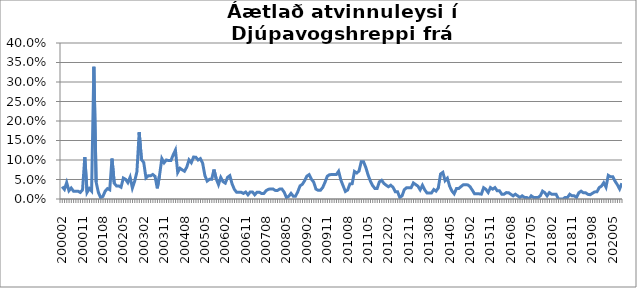
| Category | Series 0 |
|---|---|
| 200002 | 0.032 |
| 200003 | 0.025 |
| 200004 | 0.042 |
| 200005 | 0.021 |
| 200006 | 0.028 |
| 200007 | 0.02 |
| 200008 | 0.02 |
| 200009 | 0.02 |
| 200010 | 0.017 |
| 200011 | 0.023 |
| 200012 | 0.107 |
| 200101 | 0.017 |
| 200102 | 0.027 |
| 200103 | 0.02 |
| 200104 | 0.339 |
| 200105 | 0.044 |
| 200106 | 0.017 |
| 200107 | 0.003 |
| 200108 | 0.007 |
| 200109 | 0.02 |
| 200110 | 0.027 |
| 200111 | 0.023 |
| 200112 | 0.104 |
| 200201 | 0.04 |
| 200202 | 0.034 |
| 200203 | 0.034 |
| 200204 | 0.03 |
| 200205 | 0.054 |
| 200206 | 0.05 |
| 200207 | 0.042 |
| 200208 | 0.056 |
| 200209 | 0.028 |
| 200210 | 0.045 |
| 200211 | 0.07 |
| 200212 | 0.171 |
| 200301 | 0.101 |
| 200302 | 0.094 |
| 200303 | 0.054 |
| 200304 | 0.059 |
| 200305 | 0.059 |
| 200306 | 0.063 |
| 200307 | 0.058 |
| 200308 | 0.027 |
| 200309 | 0.061 |
| 200310 | 0.104 |
| 200311 | 0.093 |
| 200312 | 0.1 |
| 200401 | 0.099 |
| 200402 | 0.099 |
| 200403 | 0.113 |
| 200404 | 0.125 |
| 200405 | 0.068 |
| 200406 | 0.079 |
| 200407 | 0.075 |
| 200408 | 0.071 |
| 200409 | 0.082 |
| 200410 | 0.1 |
| 200411 | 0.093 |
| 200412 | 0.108 |
| 200501 | 0.107 |
| 200502 | 0.1 |
| 200503 | 0.104 |
| 200504 | 0.092 |
| 200505 | 0.06 |
| 200506 | 0.046 |
| 200507 | 0.05 |
| 200508 | 0.05 |
| 200509 | 0.076 |
| 200510 | 0.052 |
| 200511 | 0.037 |
| 200512 | 0.055 |
| 200601 | 0.044 |
| 200602 | 0.041 |
| 200603 | 0.056 |
| 200604 | 0.06 |
| 200605 | 0.039 |
| 200606 | 0.025 |
| 200607 | 0.017 |
| 200608 | 0.017 |
| 200609 | 0.017 |
| 200610 | 0.014 |
| 200611 | 0.018 |
| 200612 | 0.011 |
| 200701 | 0.018 |
| 200702 | 0.018 |
| 200703 | 0.011 |
| 200704 | 0.018 |
| 200705 | 0.018 |
| 200706 | 0.014 |
| 200707 | 0.014 |
| 200708 | 0.021 |
| 200709 | 0.025 |
| 200710 | 0.026 |
| 200711 | 0.026 |
| 200712 | 0.022 |
| 200801 | 0.022 |
| 200802 | 0.025 |
| 200803 | 0.025 |
| 200804 | 0.017 |
| 200805 | 0.003 |
| 200806 | 0.007 |
| 200807 | 0.014 |
| 200808 | 0.007 |
| 200809 | 0.007 |
| 200810 | 0.019 |
| 200811 | 0.034 |
| 200812 | 0.038 |
| 200901 | 0.047 |
| 200902 | 0.059 |
| 200903 | 0.062 |
| 200904 | 0.051 |
| 200905 | 0.043 |
| 200906 | 0.025 |
| 200907 | 0.022 |
| 200908 | 0.022 |
| 200909 | 0.03 |
| 200910 | 0.043 |
| 200911 | 0.058 |
| 200912 | 0.062 |
| 201001 | 0.063 |
| 201002 | 0.063 |
| 201003 | 0.063 |
| 201004 | 0.071 |
| 201005 | 0.049 |
| 201006 | 0.034 |
| 201007 | 0.019 |
| 201008 | 0.023 |
| 201009 | 0.039 |
| 201010 | 0.039 |
| 201011 | 0.071 |
| 201012 | 0.067 |
| 201101 | 0.072 |
| 201102 | 0.096 |
| 201103 | 0.096 |
| 201104 | 0.081 |
| 201105 | 0.062 |
| 201106 | 0.046 |
| 201107 | 0.035 |
| 201108 | 0.027 |
| 201109 | 0.027 |
| 201110 | 0.044 |
| 201111 | 0.048 |
| 201112 | 0.04 |
| 201201 | 0.035 |
| 201202 | 0.031 |
| 201203 | 0.035 |
| 201204 | 0.03 |
| 201205 | 0.019 |
| 201206 | 0.019 |
| 201207 | 0.004 |
| 201208 | 0.008 |
| 201209 | 0.024 |
| 201210 | 0.029 |
| 201211 | 0.029 |
| 201212 | 0.029 |
| 201301 | 0.041 |
| 201302 | 0.037 |
| 201303 | 0.033 |
| 201304 | 0.023 |
| 201305 | 0.035 |
| 201306 | 0.023 |
| 201307 | 0.016 |
| 201308 | 0.016 |
| 201309 | 0.016 |
| 201310 | 0.024 |
| 201311 | 0.02 |
| 201312 | 0.028 |
| 201401 | 0.064 |
| 201402 | 0.068 |
| 201403 | 0.047 |
| 201404 | 0.053 |
| 201405 | 0.033 |
| 201406 | 0.02 |
| 201407 | 0.013 |
| 201408 | 0.027 |
| 201409 | 0.027 |
| 201410 | 0.032 |
| 201411 | 0.036 |
| 201412 | 0.036 |
| 201501 | 0.036 |
| 201502 | 0.032 |
| 201503 | 0.023 |
| 201504 | 0.013 |
| 201505 | 0.013 |
| 201506 | 0.013 |
| 201507 | 0.012 |
| 201508 | 0.029 |
| 201509 | 0.025 |
| 201510 | 0.017 |
| 201511 | 0.029 |
| 201512 | 0.025 |
| 201601 | 0.029 |
| 201602 | 0.021 |
| 201603 | 0.021 |
| 201604 | 0.012 |
| 201605 | 0.012 |
| 201606 | 0.016 |
| 201607 | 0.016 |
| 201608 | 0.012 |
| 201609 | 0.008 |
| 201610 | 0.012 |
| 201611 | 0.008 |
| 201612 | 0.004 |
| 201701 | 0.008 |
| 201702 | 0.004 |
| 201703 | 0.004 |
| 201704 | 0 |
| 201705 | 0.008 |
| 201706 | 0.004 |
| 201707 | 0.004 |
| 201708 | 0.004 |
| 201709 | 0.008 |
| 201710 | 0.02 |
| 201711 | 0.016 |
| 201712 | 0.008 |
| 201801 | 0.016 |
| 201802 | 0.012 |
| 201803 | 0.012 |
| 201804 | 0.012 |
| 201805 | 0 |
| 201806 | 0 |
| 201807 | 0 |
| 201808 | 0.004 |
| 201809 | 0.004 |
| 201810 | 0.012 |
| 201811 | 0.008 |
| 201812 | 0.008 |
| 201901 | 0.004 |
| 201902 | 0.016 |
| 201903 | 0.02 |
| 201904 | 0.016 |
| 201905 | 0.016 |
| 201906 | 0.012 |
| 201907 | 0.011 |
| 201908 | 0.015 |
| 201909 | 0.018 |
| 201910 | 0.018 |
| 201911 | 0.029 |
| 201912 | 0.033 |
| 202001 | 0.042 |
| 202002 | 0.03 |
| 202003*** | 0.061 |
| 202004 | 0.057 |
| 202005 | 0.057 |
| 202006 | 0.046 |
| 202007 | 0.037 |
| 202008 | 0.026 |
| 202009 | 0.04 |